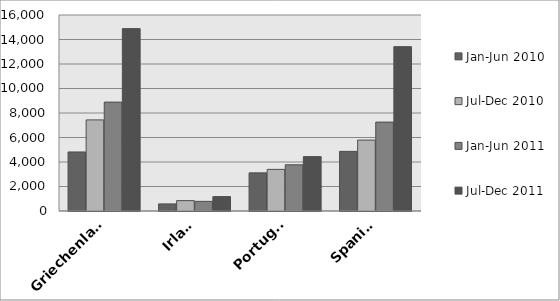
| Category | Jan-Jun 2010 | Jul-Dec 2010 | Jan-Jun 2011 | Jul-Dec 2011 |
|---|---|---|---|---|
| Griechenland | 4819 | 7437 | 8890 | 14889 |
| Irland | 579 | 847 | 787 | 1177 |
| Portugal | 3114 | 3399 | 3772 | 4441 |
| Spanien | 4868 | 5789 | 7257 | 13415 |